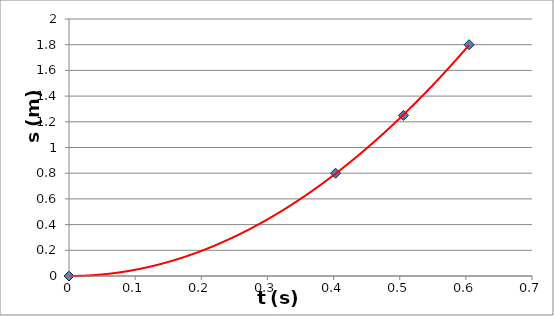
| Category | Series 0 |
|---|---|
| 0.0 | 0 |
| 0.6049 | 1.8 |
| 0.5058 | 1.25 |
| 0.403 | 0.8 |